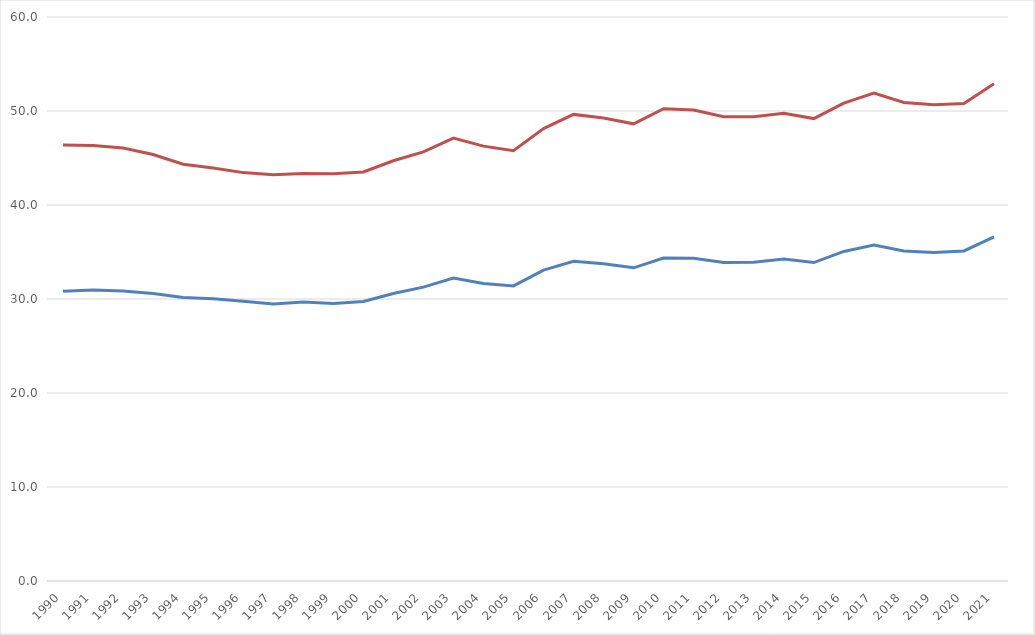
| Category | Consumo energetico totale/superficie totale | Consumo energetico totale medio/SAU |
|---|---|---|
| 1990.0 | 30.827 | 46.39 |
| 1991.0 | 30.966 | 46.337 |
| 1992.0 | 30.856 | 46.055 |
| 1993.0 | 30.574 | 45.377 |
| 1994.0 | 30.154 | 44.338 |
| 1995.0 | 30.038 | 43.935 |
| 1996.0 | 29.748 | 43.446 |
| 1997.0 | 29.465 | 43.231 |
| 1998.0 | 29.678 | 43.348 |
| 1999.0 | 29.508 | 43.33 |
| 2000.0 | 29.742 | 43.515 |
| 2001.0 | 30.58 | 44.703 |
| 2002.0 | 31.259 | 45.658 |
| 2003.0 | 32.238 | 47.112 |
| 2004.0 | 31.646 | 46.261 |
| 2005.0 | 31.392 | 45.773 |
| 2006.0 | 33.077 | 48.132 |
| 2007.0 | 34.021 | 49.637 |
| 2008.0 | 33.76 | 49.261 |
| 2009.0 | 33.318 | 48.635 |
| 2010.0 | 34.353 | 50.239 |
| 2011.0 | 34.332 | 50.111 |
| 2012.0 | 33.874 | 49.389 |
| 2013.0 | 33.901 | 49.392 |
| 2014.0 | 34.252 | 49.751 |
| 2015.0 | 33.874 | 49.191 |
| 2016.0 | 35.057 | 50.846 |
| 2017.0 | 35.75 | 51.902 |
| 2018.0 | 35.1 | 50.914 |
| 2019.0 | 34.952 | 50.667 |
| 2020.0 | 35.117 | 50.797 |
| 2021.0 | 36.618 | 52.904 |